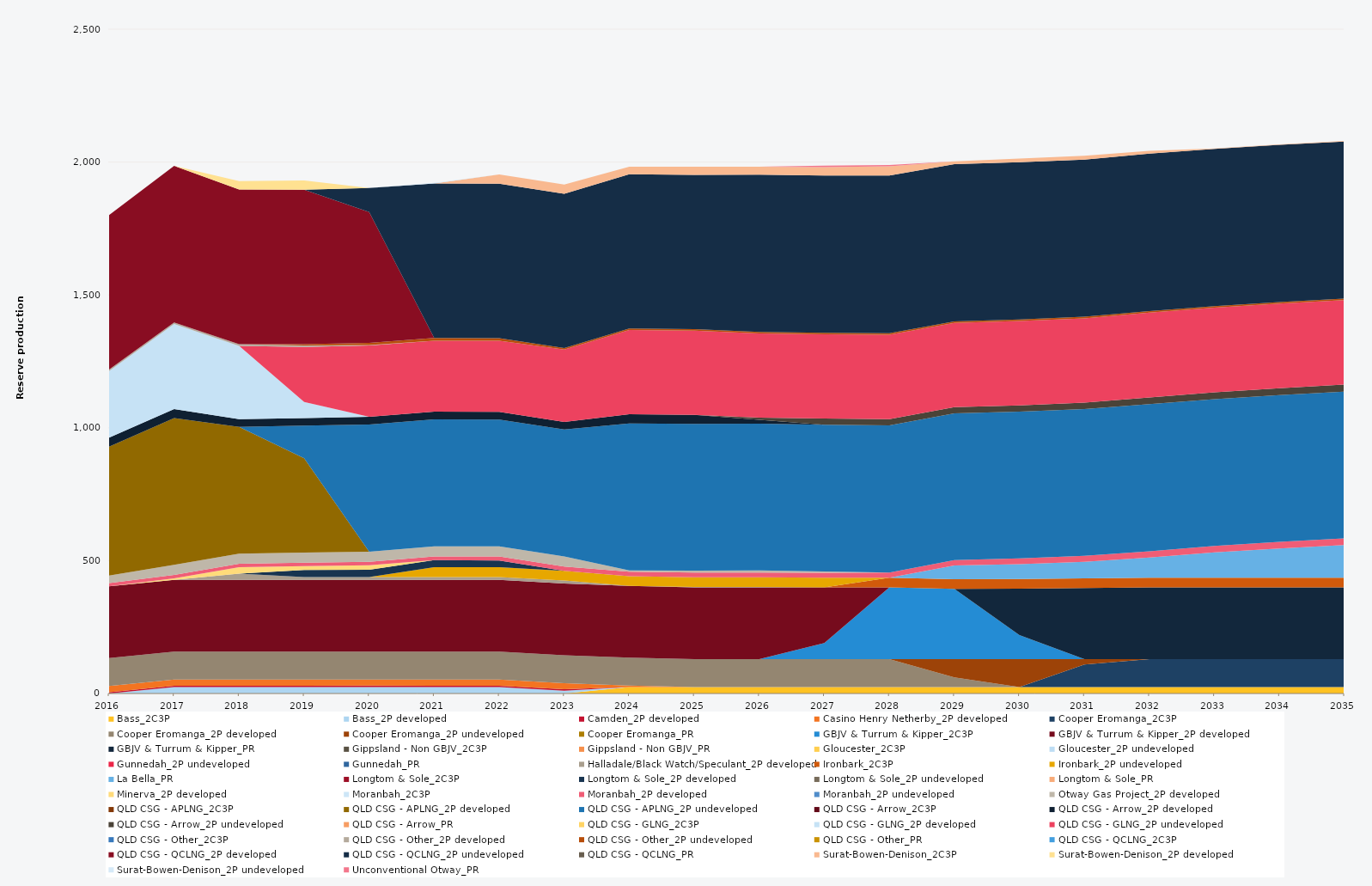
| Category | Bass_2C3P | Bass_2P developed | Camden_2P developed | Casino Henry Netherby_2P developed | Cooper Eromanga_2C3P | Cooper Eromanga_2P developed | Cooper Eromanga_2P undeveloped | Cooper Eromanga_PR | GBJV & Turrum & Kipper_2C3P | GBJV & Turrum & Kipper_2P developed | GBJV & Turrum & Kipper_PR | Gippsland - Non GBJV_2C3P | Gippsland - Non GBJV_PR | Gloucester_2C3P | Gloucester_2P undeveloped | Gunnedah_2P undeveloped | Gunnedah_PR | Halladale/Black Watch/Speculant_2P developed | Ironbark_2C3P | Ironbark_2P undeveloped | La Bella_PR | Longtom & Sole_2C3P | Longtom & Sole_2P developed | Longtom & Sole_2P undeveloped | Longtom & Sole_PR | Minerva_2P developed | Moranbah_2C3P | Moranbah_2P developed | Moranbah_2P undeveloped | Otway Gas Project_2P developed | QLD CSG - APLNG_2C3P | QLD CSG - APLNG_2P developed | QLD CSG - APLNG_2P undeveloped | QLD CSG - Arrow_2C3P | QLD CSG - Arrow_2P developed | QLD CSG - Arrow_2P undeveloped | QLD CSG - Arrow_PR | QLD CSG - GLNG_2C3P | QLD CSG - GLNG_2P developed | QLD CSG - GLNG_2P undeveloped | QLD CSG - Other_2C3P | QLD CSG - Other_2P developed | QLD CSG - Other_2P undeveloped | QLD CSG - Other_PR | QLD CSG - QCLNG_2C3P | QLD CSG - QCLNG_2P developed | QLD CSG - QCLNG_2P undeveloped | QLD CSG - QCLNG_PR | Surat-Bowen-Denison_2C3P | Surat-Bowen-Denison_2P developed | Surat-Bowen-Denison_2P undeveloped | Unconventional Otway_PR |
|---|---|---|---|---|---|---|---|---|---|---|---|---|---|---|---|---|---|---|---|---|---|---|---|---|---|---|---|---|---|---|---|---|---|---|---|---|---|---|---|---|---|---|---|---|---|---|---|---|---|---|---|---|
| 2016 | 0 | 0 | 5 | 23.12 | 0 | 105 | 0 | 0 | 0 | 270 | 0 | 0 | 0 | 0 | 0 | 0 | 0 | 0 | 0 | 0 | 0 | 0 | 0 | 0 | 0 | 0 | 0 | 12.859 | 0 | 27.952 | 0 | 484.723 | 0 | 0 | 34.038 | 0 | 0 | 0 | 250.558 | 0 | 0 | 5.856 | 0 | 0 | 0 | 581.852 | 0 | 0 | 0 | 0 | 0 | 0 |
| 2017 | 0 | 24.455 | 5 | 23.12 | 0 | 105 | 0 | 0 | 0 | 270 | 0 | 0 | 0 | 0 | 0 | 0 | 0 | 0 | 0 | 0 | 0 | 0 | 0 | 0 | 0 | 5.691 | 0 | 12.863 | 0 | 38 | 0 | 552.245 | 0 | 0 | 33.945 | 0 | 0 | 0 | 320.277 | 0 | 0 | 5.84 | 0 | 0 | 0 | 589.736 | 0 | 0 | 0 | 0 | 0 | 0 |
| 2018 | 0 | 24.455 | 5 | 23.12 | 0 | 105 | 0 | 0 | 0 | 270 | 0 | 0 | 0 | 0 | 0 | 0 | 0 | 23.725 | 0 | 0 | 0 | 0 | 0 | 0 | 0 | 23.725 | 0 | 13.029 | 0 | 38 | 0 | 477.621 | 0 | 0 | 28.853 | 0 | 0 | 0 | 276.028 | 0 | 0 | 5.84 | 0 | 0 | 0 | 582.423 | 0 | 0 | 0 | 31.885 | 0 | 0 |
| 2019 | 0 | 24.455 | 5 | 23.12 | 0 | 105 | 0 | 0 | 0 | 270 | 0 | 0 | 0 | 0 | 0 | 0 | 0 | 10.95 | 0 | 0 | 0 | 0 | 26.378 | 0 | 0 | 14.764 | 0 | 12.796 | 0 | 38 | 0 | 354.961 | 122.66 | 0 | 28.853 | 0 | 0 | 0 | 60.437 | 206.872 | 0 | 5.84 | 4.563 | 0 | 0 | 581.21 | 0 | 0 | 0 | 34.93 | 0 | 0 |
| 2020 | 0 | 24.522 | 5 | 23.12 | 0 | 105 | 0 | 0 | 0 | 270 | 0 | 0 | 0 | 0 | 0 | 0 | 0 | 10.95 | 0 | 0 | 0 | 0 | 27.45 | 0 | 0 | 16.571 | 0 | 12.768 | 0 | 38 | 0 | 0 | 478.929 | 0 | 28.932 | 0 | 0 | 0 | 0 | 268.203 | 0 | 1.624 | 8.795 | 0 | 0 | 492.179 | 90.506 | 0 | 0 | 0 | 0 | 0 |
| 2021 | 0 | 24.455 | 5 | 23.12 | 0 | 105 | 0 | 0 | 0 | 270 | 0 | 0 | 0 | 0 | 0 | 0 | 0 | 10.95 | 0 | 36.5 | 0 | 0 | 27.375 | 0 | 0 | 0 | 0 | 13.526 | 0 | 38 | 0 | 0 | 477.621 | 0 | 28.853 | 0 | 0 | 0 | 0 | 267.498 | 0 | 0 | 10.403 | 0 | 0 | 0 | 581.226 | 0 | 0 | 0 | 2 | 0 |
| 2022 | 0 | 24.455 | 5 | 23.12 | 0 | 105 | 0 | 0 | 0 | 270 | 0 | 0 | 0 | 0 | 0 | 0 | 0 | 10.95 | 0 | 36.5 | 0 | 0 | 25.279 | 0 | 0 | 0 | 0 | 15.305 | 0 | 38 | 0 | 0 | 477.621 | 0 | 28.853 | 0 | 0 | 0 | 0 | 267.149 | 0 | 0 | 10.403 | 0 | 0 | 0 | 581.126 | 0 | 34.93 | 0 | 0 | 0 |
| 2023 | 0 | 10.85 | 5 | 23.12 | 0 | 105 | 0 | 0 | 0 | 270 | 0 | 0 | 0 | 0 | 0 | 0 | 0 | 10.95 | 0 | 36.5 | 0 | 0 | 0 | 0 | 0 | 0 | 0 | 16.282 | 0 | 38 | 0 | 0 | 477.621 | 0 | 28.853 | 0 | 0 | 0 | 0 | 271.923 | 0 | 0 | 5.84 | 0 | 0 | 0 | 580.961 | 0 | 34.93 | 0 | 0 | 0 |
| 2024 | 24.522 | 0 | 0 | 5.3 | 0 | 105 | 0 | 0 | 0 | 270 | 0 | 0 | 0 | 0 | 0 | 0 | 0 | 0.173 | 0 | 36.6 | 0 | 0 | 0 | 0 | 0 | 0 | 0 | 16.806 | 0 | 4.516 | 0 | 0 | 553.758 | 0 | 34.038 | 0 | 0 | 0 | 0 | 317.367 | 0 | 0 | 5.856 | 0 | 0 | 0 | 580.633 | 0 | 27.848 | 0 | 0 | 0 |
| 2025 | 24.455 | 0 | 0 | 0 | 0 | 105 | 0 | 0 | 0 | 270 | 0 | 0 | 0 | 0 | 0 | 0 | 0 | 1.737 | 0 | 36.5 | 0 | 0 | 0 | 0 | 0 | 0 | 0 | 17.285 | 0 | 7.762 | 0 | 0 | 552.245 | 0 | 33.945 | 0 | 0 | 0 | 0 | 316.806 | 0 | 0 | 5.84 | 0 | 0 | 0 | 579.927 | 0 | 31.345 | 0 | 0 | 0 |
| 2026 | 24.455 | 0 | 0 | 0 | 0 | 105 | 0 | 0 | 0 | 270 | 0 | 0 | 0 | 0 | 0 | 0 | 0 | 1.462 | 0 | 36.5 | 0 | 0 | 0 | 0 | 0 | 0 | 0 | 17.534 | 0 | 8.342 | 0 | 0 | 552.245 | 0 | 14.785 | 8.09 | 0 | 0 | 0 | 316.704 | 0 | 0 | 5.84 | 0 | 0 | 0 | 591.753 | 0 | 29.688 | 0 | 0 | 0 |
| 2027 | 24.455 | 0 | 0 | 0 | 0 | 105 | 0 | 0 | 60.893 | 209.107 | 0 | 0 | 0 | 0 | 0 | 0 | 0 | 0.153 | 0 | 36.5 | 0 | 0 | 0 | 0 | 0 | 0 | 0 | 18.159 | 0 | 5.034 | 0 | 0 | 552.245 | 0 | 0 | 23.167 | 0 | 0 | 0 | 316.867 | 0 | 0 | 5.84 | 0 | 0 | 0 | 591.694 | 0 | 31.527 | 0 | 0 | 5.72 |
| 2028 | 24.522 | 0 | 0 | 0 | 0 | 105 | 0 | 0 | 270 | 0 | 0 | 0 | 0 | 0 | 0 | 0 | 0 | 0 | 36.2 | 0.4 | 0 | 0 | 0 | 0 | 0 | 0 | 0 | 19.008 | 0 | 0 | 0 | 0 | 553.758 | 0 | 0 | 23.513 | 0 | 0 | 0 | 317.838 | 0 | 0 | 5.856 | 0 | 0 | 0 | 593.235 | 0 | 34.537 | 0 | 0 | 5.28 |
| 2029 | 24.455 | 0 | 0 | 0 | 0 | 36 | 69 | 0 | 264.087 | 0 | 0 | 0 | 0 | 0 | 0 | 0 | 0 | 0 | 36.5 | 0 | 51.489 | 0 | 0 | 0 | 0 | 0 | 0 | 20.36 | 0 | 0 | 0 | 0 | 552.245 | 0 | 0 | 23.397 | 0 | 0 | 0 | 316.91 | 0 | 0 | 5.84 | 0 | 0 | 0 | 591.622 | 0 | 10.875 | 0 | 0 | 0 |
| 2030 | 24.455 | 0 | 0 | 0 | 0 | 0 | 105 | 0 | 90.734 | 0 | 174.197 | 0 | 0 | 0 | 0 | 0 | 0 | 0 | 36.5 | 0 | 56.072 | 0 | 0 | 0 | 0 | 0 | 0 | 21.622 | 0 | 0 | 0 | 0 | 552.245 | 0 | 0 | 23.644 | 0 | 0 | 0 | 317.293 | 0 | 0 | 5.84 | 0 | 0 | 0 | 591.579 | 0 | 14.285 | 0 | 0 | 0 |
| 2031 | 24.455 | 0 | 0 | 0 | 84.418 | 0 | 20.582 | 0 | 0 | 0 | 267.384 | 0 | 0 | 0 | 0 | 0 | 0 | 0 | 36.5 | 0 | 62.011 | 0 | 0 | 0 | 0 | 0 | 0 | 22.567 | 0 | 0 | 0 | 0 | 552.245 | 0 | 0 | 24.211 | 0 | 0 | 0 | 317.568 | 0 | 0 | 5.84 | 0 | 0 | 0 | 591.53 | 0 | 14.374 | 0 | 0 | 0 |
| 2032 | 24.522 | 0 | 0 | 0 | 105 | 0 | 0 | 0 | 0 | 0 | 270 | 0 | 0 | 0 | 0 | 0 | 0 | 0 | 36.6 | 0 | 75.825 | 0 | 0 | 0 | 0 | 0 | 0 | 23.484 | 0 | 0 | 0 | 0 | 553.758 | 0 | 0 | 25.31 | 0 | 0 | 0 | 318.7 | 0 | 0 | 5.856 | 0 | 0 | 0 | 593.07 | 0 | 10.005 | 0 | 0 | 0 |
| 2033 | 24.455 | 0 | 0 | 0 | 105 | 0 | 0 | 0 | 0 | 0 | 270 | 0 | 0 | 0 | 0 | 0 | 0 | 0 | 36.5 | 0 | 95.405 | 0 | 0 | 0 | 0 | 0 | 0 | 23.992 | 0 | 0 | 0 | 0 | 552.245 | 0 | 0 | 26.325 | 0 | 0 | 0 | 318.169 | 0 | 0 | 5.84 | 0 | 0 | 0 | 591.435 | 0 | 2.284 | 0 | 0 | 0 |
| 2034 | 24.455 | 0 | 0 | 0 | 105 | 0 | 0 | 0 | 0 | 0 | 270 | 0 | 0 | 0 | 0 | 0 | 0 | 0 | 36.5 | 0 | 110.058 | 0 | 0 | 0 | 0 | 0 | 0 | 24.563 | 0 | 0 | 0 | 0 | 552.245 | 0 | 0 | 26.511 | 0 | 0 | 0 | 318.356 | 0 | 0 | 5.84 | 0 | 0 | 0 | 591.394 | 0 | 1.651 | 0 | 0 | 0 |
| 2035 | 24.455 | 0 | 0 | 0 | 105 | 0 | 0 | 0 | 0 | 0 | 270 | 0 | 0 | 0 | 0 | 0 | 0 | 0 | 36.5 | 0 | 123.022 | 0 | 0 | 0 | 0 | 0 | 0 | 24.813 | 0 | 0 | 0 | 0 | 552.245 | 0 | 0 | 26.426 | 0 | 0 | 0 | 317.84 | 0 | 0 | 5.84 | 0 | 0 | 0 | 591.053 | 0 | 2.418 | 0 | 0 | 0 |